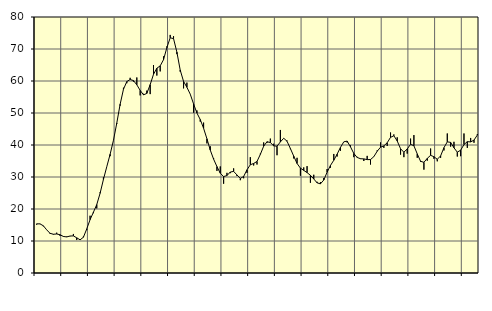
| Category | Piggar | Series 1 |
|---|---|---|
| nan | 15.1 | 15.37 |
| 87.0 | 15.3 | 15.35 |
| 87.0 | 14.6 | 14.76 |
| 87.0 | 13.5 | 13.49 |
| nan | 12.2 | 12.41 |
| 88.0 | 12 | 12.11 |
| 88.0 | 12.6 | 12.19 |
| 88.0 | 11.6 | 11.96 |
| nan | 11.3 | 11.42 |
| 89.0 | 11.4 | 11.27 |
| 89.0 | 11.5 | 11.56 |
| 89.0 | 12.2 | 11.59 |
| nan | 10.3 | 11 |
| 90.0 | 10.6 | 10.37 |
| 90.0 | 11.4 | 11.17 |
| 90.0 | 13.4 | 13.77 |
| nan | 17.9 | 16.67 |
| 91.0 | 18.7 | 18.98 |
| 91.0 | 20.2 | 21.38 |
| 91.0 | 25.2 | 24.92 |
| nan | 29.9 | 29.23 |
| 92.0 | 33.2 | 33.21 |
| 92.0 | 36.5 | 37.09 |
| 92.0 | 41.5 | 41.45 |
| nan | 46.6 | 46.85 |
| 93.0 | 52.3 | 52.72 |
| 93.0 | 57.9 | 57.41 |
| 93.0 | 59.3 | 59.82 |
| nan | 61 | 60.47 |
| 94.0 | 59.8 | 60.13 |
| 94.0 | 61.1 | 58.81 |
| 94.0 | 55.5 | 57.07 |
| nan | 56 | 55.67 |
| 95.0 | 57 | 56.12 |
| 95.0 | 55.9 | 58.87 |
| 95.0 | 65 | 62.09 |
| nan | 61.7 | 63.99 |
| 96.0 | 63 | 64.73 |
| 96.0 | 67.7 | 66.66 |
| 96.0 | 70.8 | 70.43 |
| nan | 74.4 | 73.5 |
| 97.0 | 74 | 73.25 |
| 97.0 | 68.4 | 69.02 |
| 97.0 | 62.9 | 63.42 |
| nan | 57.7 | 59.87 |
| 98.0 | 59.5 | 58.04 |
| 98.0 | 55.9 | 55.9 |
| 98.0 | 50.1 | 52.84 |
| nan | 50.8 | 50 |
| 99.0 | 47.3 | 47.96 |
| 99.0 | 47 | 45.23 |
| 99.0 | 40.5 | 41.94 |
| nan | 39.6 | 38.42 |
| 0.0 | 35.9 | 35.58 |
| 0.0 | 31.9 | 33.25 |
| 0.0 | 33.3 | 31.18 |
| nan | 27.9 | 30.14 |
| 1.0 | 31.3 | 30.45 |
| 1.0 | 31.2 | 31.55 |
| 1.0 | 32.7 | 31.75 |
| nan | 30.3 | 30.64 |
| 2.0 | 29 | 29.56 |
| 2.0 | 29.6 | 30.17 |
| 2.0 | 31.3 | 32.25 |
| nan | 36.2 | 33.83 |
| 3.0 | 33.6 | 34.23 |
| 3.0 | 33.9 | 34.86 |
| 3.0 | 37.3 | 37.07 |
| nan | 40.8 | 39.63 |
| 4.0 | 40.7 | 41.02 |
| 4.0 | 42 | 40.77 |
| 4.0 | 40.4 | 39.73 |
| nan | 36.8 | 39.63 |
| 5.0 | 44.7 | 40.96 |
| 5.0 | 42.1 | 42.11 |
| 5.0 | 41.4 | 41.17 |
| nan | 38.7 | 38.91 |
| 6.0 | 35.8 | 36.51 |
| 6.0 | 36 | 34.23 |
| 6.0 | 30.4 | 32.78 |
| nan | 33 | 32.07 |
| 7.0 | 33.4 | 31.38 |
| 7.0 | 28.2 | 30.53 |
| 7.0 | 30.7 | 29.38 |
| nan | 28.5 | 28.18 |
| 8.0 | 28.4 | 27.85 |
| 8.0 | 29.7 | 29.06 |
| 8.0 | 32.5 | 31.49 |
| nan | 32.9 | 33.6 |
| 9.0 | 37.2 | 35.23 |
| 9.0 | 36.4 | 37.13 |
| 9.0 | 38.2 | 39.25 |
| nan | 41 | 41 |
| 10.0 | 40.8 | 41.22 |
| 10.0 | 39.9 | 39.43 |
| 10.0 | 36.2 | 37.36 |
| nan | 36.3 | 36.11 |
| 11.0 | 35.8 | 35.71 |
| 11.0 | 35 | 35.66 |
| 11.0 | 36.6 | 35.43 |
| nan | 33.9 | 35.45 |
| 12.0 | 36.4 | 36.35 |
| 12.0 | 38.3 | 38.05 |
| 12.0 | 40.8 | 39.31 |
| nan | 39.1 | 39.72 |
| 13.0 | 39.7 | 40.7 |
| 13.0 | 43.9 | 42.39 |
| 13.0 | 43.3 | 42.89 |
| nan | 42.4 | 41.26 |
| 14.0 | 37 | 38.83 |
| 14.0 | 36.2 | 37.74 |
| 14.0 | 37.3 | 38.77 |
| nan | 42 | 40.21 |
| 15.0 | 43.1 | 39.77 |
| 15.0 | 36 | 37.23 |
| 15.0 | 34.7 | 34.9 |
| nan | 32.3 | 34.59 |
| 16.0 | 35.1 | 35.82 |
| 16.0 | 38.9 | 36.77 |
| 16.0 | 35.7 | 36.34 |
| nan | 34.9 | 35.54 |
| 17.0 | 36 | 36.59 |
| 17.0 | 38.3 | 39.16 |
| 17.0 | 43.6 | 40.99 |
| nan | 39.5 | 40.82 |
| 18.0 | 41 | 39.12 |
| 18.0 | 36.4 | 37.76 |
| 18.0 | 36.5 | 38.37 |
| nan | 43.6 | 40.13 |
| 19.0 | 39.1 | 41.05 |
| 19.0 | 42.2 | 40.96 |
| 19.0 | 40.7 | 41.53 |
| nan | 43.4 | 43.11 |